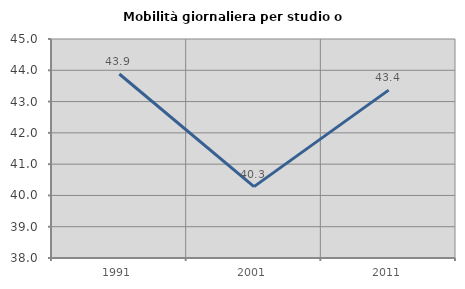
| Category | Mobilità giornaliera per studio o lavoro |
|---|---|
| 1991.0 | 43.881 |
| 2001.0 | 40.282 |
| 2011.0 | 43.365 |